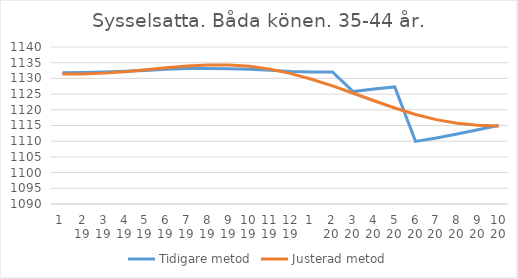
| Category | Tidigare metod | Justerad metod |
|---|---|---|
| 0 | 1131.79 | 1131.39 |
| 1 | 1131.84 | 1131.42 |
| 2 | 1132.01 | 1131.68 |
| 3 | 1132.25 | 1132.14 |
| 4 | 1132.55 | 1132.74 |
| 5 | 1132.88 | 1133.38 |
| 6 | 1133.14 | 1133.95 |
| 7 | 1133.19 | 1134.26 |
| 8 | 1133.07 | 1134.24 |
| 9 | 1132.9 | 1133.88 |
| 10 | 1132.57 | 1132.95 |
| 11 | 1132.21 | 1131.51 |
| 12 | 1132.04 | 1129.72 |
| 13 | 1132.04 | 1127.61 |
| 14 | 1125.8 | 1125.27 |
| 15 | 1126.64 | 1122.89 |
| 16 | 1127.28 | 1120.57 |
| 17 | 1109.94 | 1118.52 |
| 18 | 1111.03 | 1116.87 |
| 19 | 1112.29 | 1115.71 |
| 20 | 1113.63 | 1115.05 |
| 21 | 1114.99 | 1114.86 |